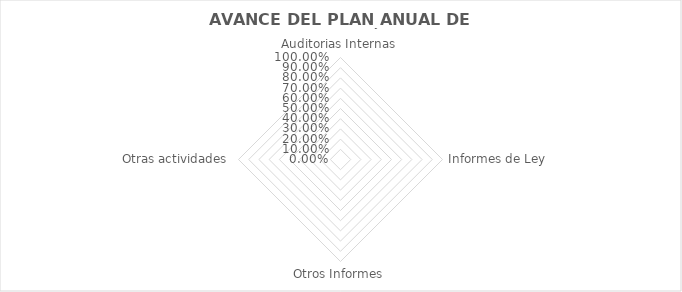
| Category | % DE AVANCE |
|---|---|
| Auditorias Internas | 0 |
| Informes de Ley | 0 |
| Otros Informes | 0 |
| Otras actividades | 0 |